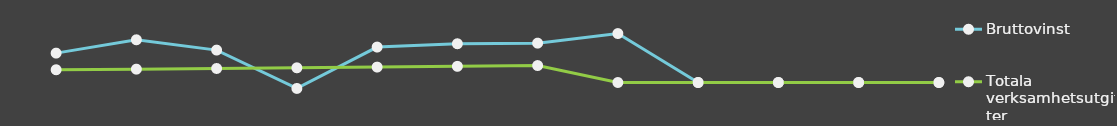
| Category | Bruttovinst | Totala verksamhetsutgifter |
|---|---|---|
| 0 | 25000 | 10841 |
| 1 | 36348 | 11367.25 |
| 2 | 27562 | 11919.82 |
| 3 | -5059.5 | 12500.01 |
| 4 | 30153.18 | 13109.21 |
| 5 | 32964.45 | 13748.86 |
| 6 | 33502.87 | 14420.51 |
| 7 | 41646 | 0 |
| 8 | 0 | 0 |
| 9 | 0 | 0 |
| 10 | 0 | 0 |
| 11 | 0 | 0 |